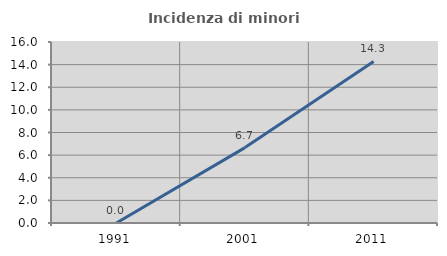
| Category | Incidenza di minori stranieri |
|---|---|
| 1991.0 | 0 |
| 2001.0 | 6.667 |
| 2011.0 | 14.286 |